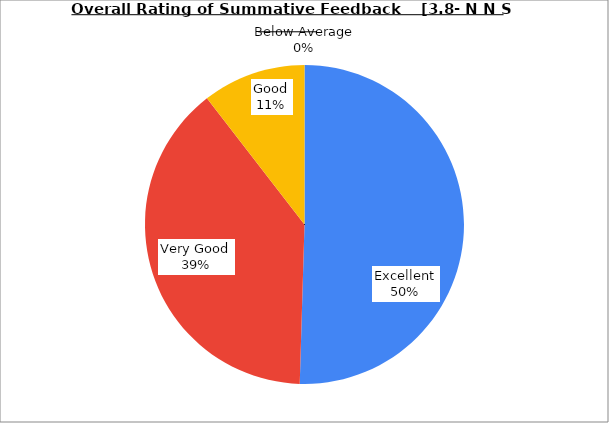
| Category | Series 0 |
|---|---|
| Excellent | 50.476 |
| Very Good | 39.048 |
| Good | 10.476 |
| Average | 0 |
| Below Average | 0 |